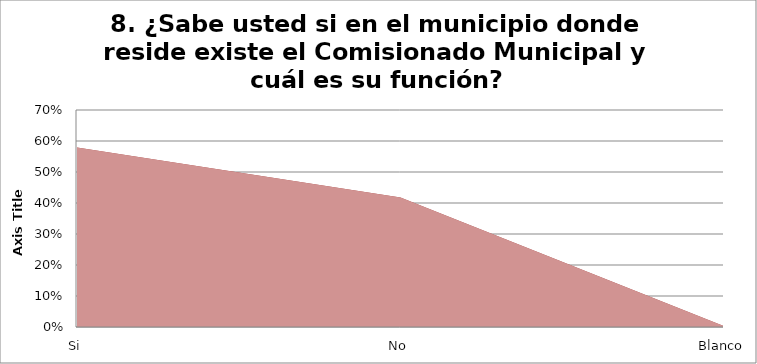
| Category | Series 0 | Series 1 |
|---|---|---|
| Si | 0.579 | 0.579 |
| No | 0.418 | 0.418 |
| Blanco | 0.003 | 0.003 |